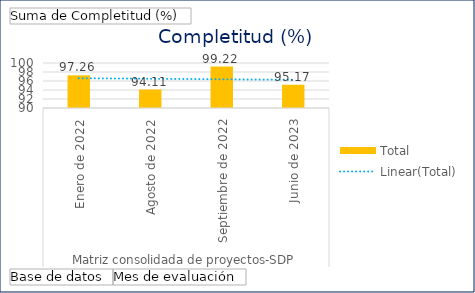
| Category | Total |
|---|---|
| 0 | 97.26 |
| 1 | 94.11 |
| 2 | 99.22 |
| 3 | 95.17 |